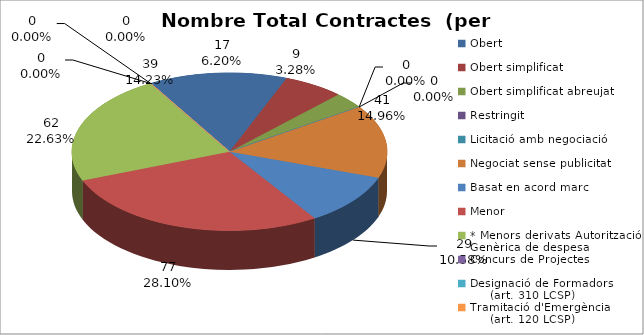
| Category | Nombre Total Contractes |
|---|---|
| Obert | 39 |
| Obert simplificat | 17 |
| Obert simplificat abreujat | 9 |
| Restringit | 0 |
| Licitació amb negociació | 0 |
| Negociat sense publicitat | 41 |
| Basat en acord marc | 29 |
| Menor | 77 |
| * Menors derivats Autorització Genèrica de despesa | 62 |
| Concurs de Projectes | 0 |
| Designació de Formadors
     (art. 310 LCSP) | 0 |
| Tramitació d'Emergència
     (art. 120 LCSP) | 0 |